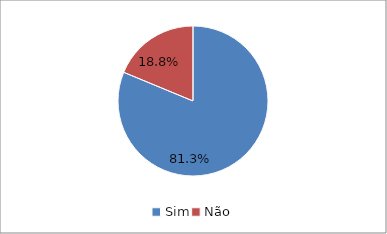
| Category | Series 0 |
|---|---|
| Sim | 0.812 |
| Não | 0.188 |